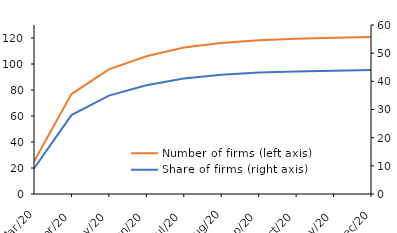
| Category | Number of firms (left axis) |
|---|---|
| 2020-03-01 | 24.912 |
| 2020-04-01 | 76.868 |
| 2020-05-01 | 95.841 |
| 2020-06-01 | 106.012 |
| 2020-07-01 | 112.617 |
| 2020-08-01 | 116.218 |
| 2020-09-01 | 118.326 |
| 2020-10-01 | 119.355 |
| 2020-11-01 | 120.179 |
| 2020-12-01 | 120.784 |